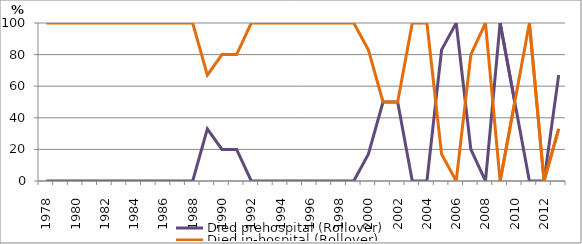
| Category | Died prehospital (Rollover) | Died in-hospital (Rollover) |
|---|---|---|
| 1978.0 | 0 | 100 |
| 1979.0 | 0 | 100 |
| 1980.0 | 0 | 100 |
| 1981.0 | 0 | 100 |
| 1982.0 | 0 | 100 |
| 1983.0 | 0 | 100 |
| 1984.0 | 0 | 100 |
| 1985.0 | 0 | 100 |
| 1986.0 | 0 | 100 |
| 1987.0 | 0 | 100 |
| 1988.0 | 0 | 100 |
| 1989.0 | 33 | 67 |
| 1990.0 | 20 | 80 |
| 1991.0 | 20 | 80 |
| 1992.0 | 0 | 100 |
| 1993.0 | 0 | 100 |
| 1994.0 | 0 | 100 |
| 1995.0 | 0 | 100 |
| 1996.0 | 0 | 100 |
| 1997.0 | 0 | 100 |
| 1998.0 | 0 | 100 |
| 1999.0 | 0 | 100 |
| 2000.0 | 17 | 83 |
| 2001.0 | 50 | 50 |
| 2002.0 | 50 | 50 |
| 2003.0 | 0 | 100 |
| 2004.0 | 0 | 100 |
| 2005.0 | 83 | 17 |
| 2006.0 | 100 | 0 |
| 2007.0 | 20 | 80 |
| 2008.0 | 0 | 100 |
| 2009.0 | 100 | 0 |
| 2010.0 | 50 | 50 |
| 2011.0 | 0 | 100 |
| 2012.0 | 0 | 0 |
| 2013.0 | 67 | 33 |